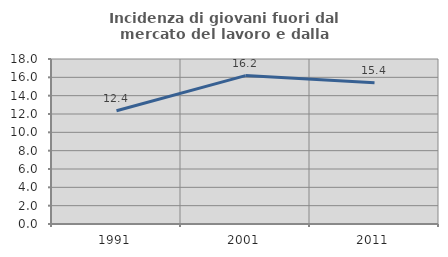
| Category | Incidenza di giovani fuori dal mercato del lavoro e dalla formazione  |
|---|---|
| 1991.0 | 12.358 |
| 2001.0 | 16.192 |
| 2011.0 | 15.398 |